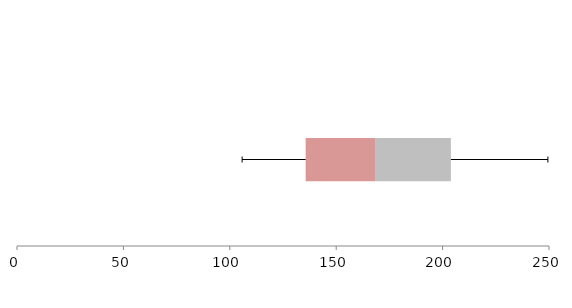
| Category | Series 1 | Series 2 | Series 3 |
|---|---|---|---|
| 0 | 135.65 | 32.908 | 35.348 |